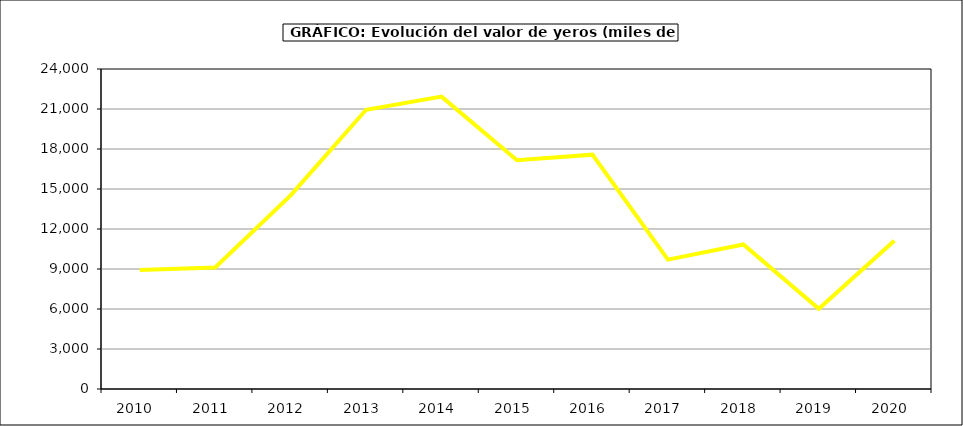
| Category | Valor |
|---|---|
| 2010.0 | 8923.742 |
| 2011.0 | 9108.203 |
| 2012.0 | 14519.486 |
| 2013.0 | 20944.865 |
| 2014.0 | 21928.601 |
| 2015.0 | 17159 |
| 2016.0 | 17573 |
| 2017.0 | 9700.839 |
| 2018.0 | 10839.154 |
| 2019.0 | 6015.545 |
| 2020.0 | 11117.078 |